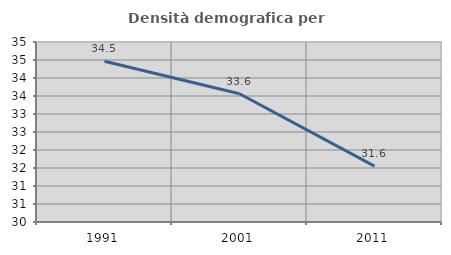
| Category | Densità demografica |
|---|---|
| 1991.0 | 34.465 |
| 2001.0 | 33.563 |
| 2011.0 | 31.552 |